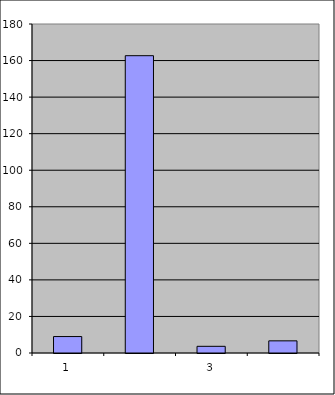
| Category | Series 0 |
|---|---|
| 0 | 9 |
| 1 | 162.655 |
| 2 | 3.656 |
| 3 | 6.648 |